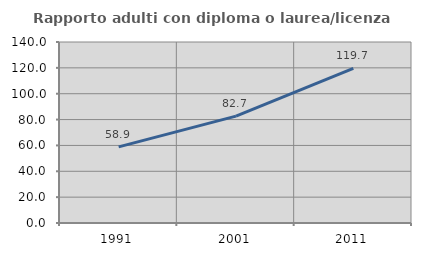
| Category | Rapporto adulti con diploma o laurea/licenza media  |
|---|---|
| 1991.0 | 58.896 |
| 2001.0 | 82.7 |
| 2011.0 | 119.661 |